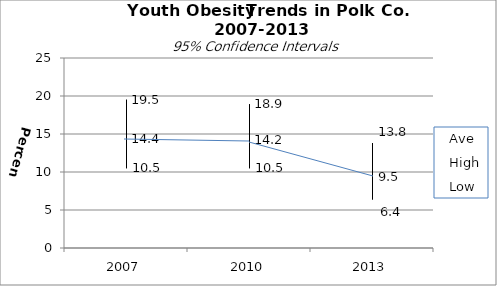
| Category | Ave | High | Low |
|---|---|---|---|
| 2007.0 | 14.4 | 19.5 | 10.5 |
| 2010.0 | 14.2 | 18.9 | 10.5 |
| 2013.0 | 9.5 | 13.8 | 6.4 |